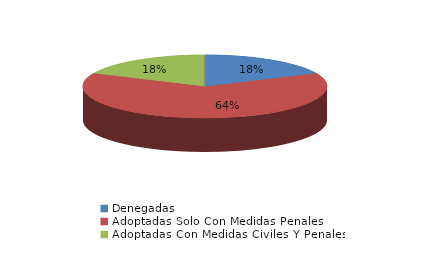
| Category | Series 0 |
|---|---|
| Denegadas | 2 |
| Adoptadas Solo Con Medidas Penales | 7 |
| Adoptadas Con Medidas Civiles Y Penales | 2 |
| Adoptadas Con Medidas Solo Civiles | 0 |